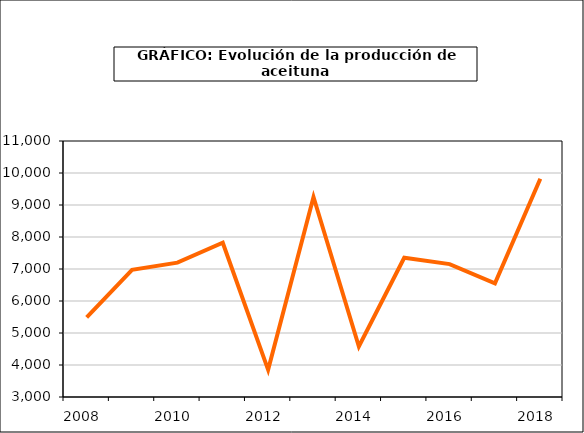
| Category | Series 0 |
|---|---|
| 2008.0 | 5485.374 |
| 2009.0 | 6972.094 |
| 2010.0 | 7197.6 |
| 2011.0 | 7820.06 |
| 2012.0 | 3849.263 |
| 2013.0 | 9250.61 |
| 2014.0 | 4579.208 |
| 2015.0 | 7352.095 |
| 2016.0 | 7154.076 |
| 2017.0 | 6549.499 |
| 2018.0 | 9819.569 |